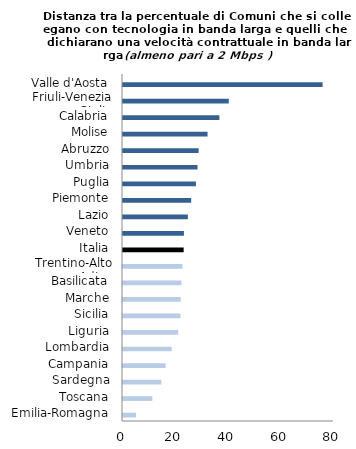
| Category | Distanza tra la percentuale di Comuni che si collegano con tecnologia in banda larga e quelli che dichiarano una velocità contrattuale almeno pari a 2 Mbps  | Series 1 |
|---|---|---|
| Emilia-Romagna | 4.96 |  |
| Toscana | 11.13 |  |
| Sardegna | 14.54 |  |
| Campania | 16.15 |  |
| Lombardia | 18.47 |  |
| Liguria | 20.95 |  |
| Sicilia | 21.8 |  |
| Marche | 21.87 |  |
| Basilicata | 22.19 |  |
| Trentino-Alto Adige | 22.53 |  |
| Italia | 23 |  |
| Veneto | 23.1 |  |
| Lazio | 24.59 |  |
| Piemonte | 25.85 |  |
| Puglia | 27.65 |  |
| Umbria | 28.27 |  |
| Abruzzo | 28.68 |  |
| Molise | 32.06 |  |
| Calabria | 36.56 |  |
| Friuli-Venezia Giulia | 40.1 |  |
| Valle d'Aosta | 75.68 |  |